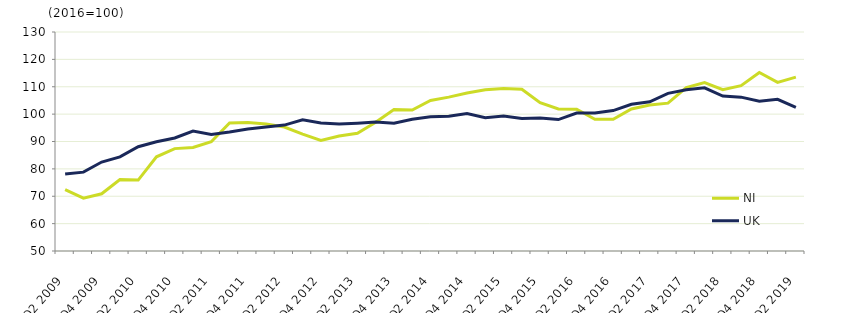
| Category | NI | UK  |
|---|---|---|
| Q2 2009 | 72.4 | 78.1 |
|  | 69.3 | 78.8 |
| Q4 2009 | 70.9 | 82.5 |
|  | 76.1 | 84.4 |
| Q2 2010 | 75.9 | 88.1 |
|  | 84.4 | 89.9 |
| Q4 2010 | 87.4 | 91.3 |
|  | 87.8 | 93.8 |
| Q2 2011 | 89.9 | 92.6 |
|  | 96.8 | 93.5 |
| Q4 2011 | 96.9 | 94.6 |
|  | 96.4 | 95.3 |
| Q2 2012 | 95.3 | 96 |
|  | 92.7 | 97.9 |
| Q4 2012 | 90.4 | 96.8 |
|  | 92 | 96.4 |
| Q2 2013 | 93 | 96.7 |
|  | 97 | 97.1 |
| Q4 2013 | 101.7 | 96.7 |
|  | 101.5 | 98.1 |
| Q2 2014 | 105 | 99 |
|  | 106.2 | 99.2 |
| Q4 2014 | 107.7 | 100.2 |
|  | 108.9 | 98.7 |
| Q2 2015 | 109.4 | 99.3 |
|  | 109.1 | 98.4 |
| Q4 2015 | 104.2 | 98.6 |
|  | 101.9 | 98 |
| Q2 2016 | 101.8 | 100.4 |
|  | 98.1 | 100.4 |
| Q4 2016 | 98.1 | 101.3 |
|  | 101.9 | 103.6 |
| Q2 2017 | 103.3 | 104.5 |
|  | 104 | 107.6 |
| Q4 2017 | 109.7 | 108.9 |
|  | 111.5 | 109.6 |
| Q2 2018 | 108.9 | 106.6 |
|  | 110.4 | 106.2 |
| Q4 2018 | 115.2 | 104.7 |
|  | 111.6 | 105.4 |
| Q2 2019 | 113.5 | 102.5 |